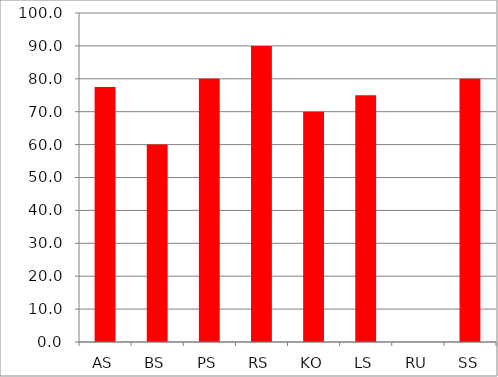
| Category | Series 0 |
|---|---|
| AS | 77.5 |
| BS | 60 |
| PS | 80 |
| RS | 90 |
| KO | 70 |
| LS | 75 |
| RU | 0 |
| SS | 80 |